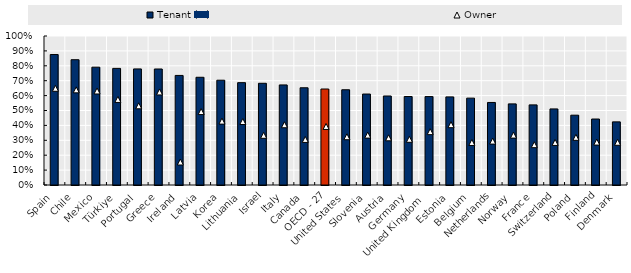
| Category | Tenant (↓) |
|---|---|
| Spain | 0.876 |
| Chile | 0.841 |
| Mexico | 0.791 |
| Türkiye | 0.783 |
| Portugal | 0.779 |
| Greece | 0.779 |
| Ireland | 0.735 |
| Latvia | 0.723 |
| Korea | 0.703 |
| Lithuania | 0.687 |
| Israel | 0.683 |
| Italy | 0.672 |
| Canada | 0.653 |
| OECD - 27 | 0.644 |
| United States | 0.639 |
| Slovenia | 0.61 |
| Austria | 0.598 |
| Germany | 0.594 |
| United Kingdom  | 0.593 |
| Estonia | 0.591 |
| Belgium | 0.583 |
| Netherlands | 0.554 |
| Norway | 0.544 |
| France | 0.538 |
| Switzerland | 0.511 |
| Poland | 0.469 |
| Finland | 0.443 |
| Denmark | 0.424 |